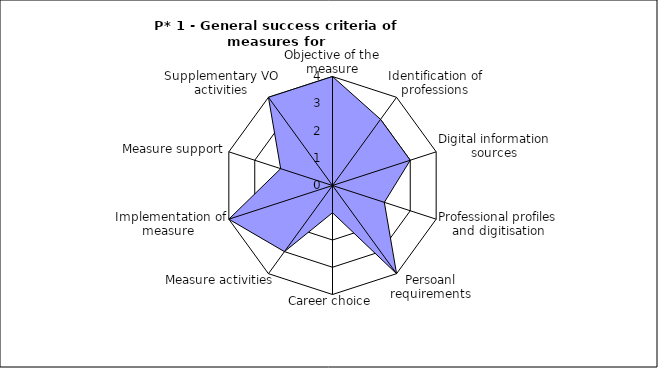
| Category | Series 0 |
|---|---|
| Objective of the measure | 4 |
| Identification of professions | 3 |
| Digital information sources | 3 |
| Professional profiles and digitisation | 2 |
| Persoanl requirements | 4 |
| Career choice | 1 |
| Measure activities | 3 |
| Implementation of measure  | 4 |
| Measure support | 2 |
| Supplementary VO activities | 4 |